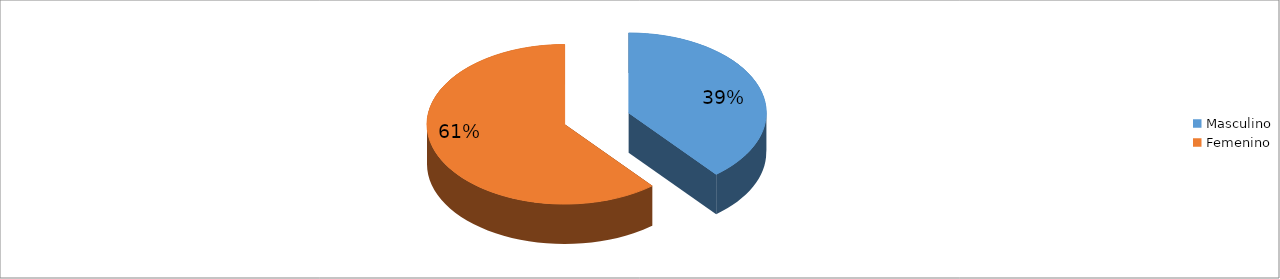
| Category | Series 0 |
|---|---|
| Masculino | 0.39 |
| Femenino | 0.61 |